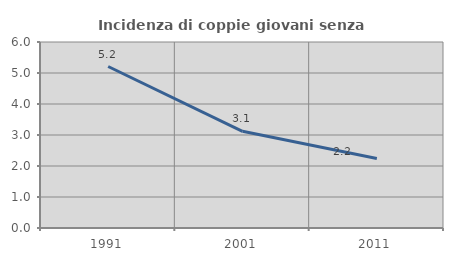
| Category | Incidenza di coppie giovani senza figli |
|---|---|
| 1991.0 | 5.209 |
| 2001.0 | 3.119 |
| 2011.0 | 2.241 |